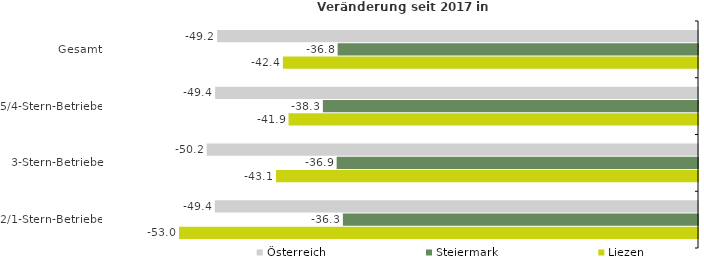
| Category | Österreich | Steiermark | Liezen |
|---|---|---|---|
| Gesamt | -49.154 | -36.835 | -42.432 |
| 5/4-Stern-Betriebe | -49.355 | -38.346 | -41.85 |
| 3-Stern-Betriebe | -50.222 | -36.936 | -43.136 |
| 2/1-Stern-Betriebe | -49.399 | -36.296 | -53.045 |